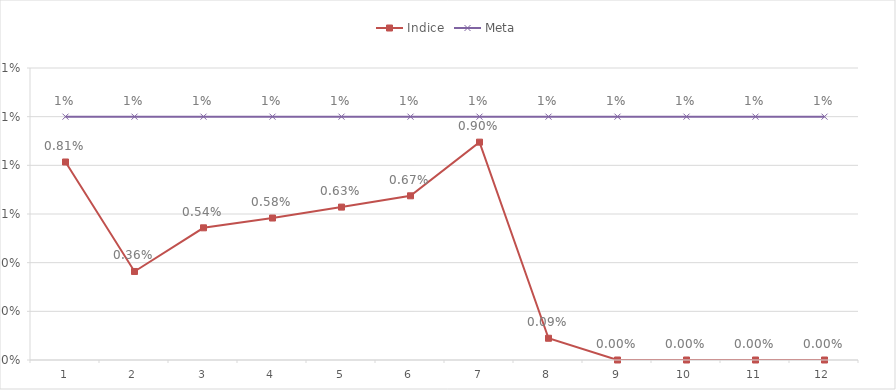
| Category | Indice | Meta |
|---|---|---|
| 0 | 0.008 | 0.01 |
| 1 | 0.004 | 0.01 |
| 2 | 0.005 | 0.01 |
| 3 | 0.006 | 0.01 |
| 4 | 0.006 | 0.01 |
| 5 | 0.007 | 0.01 |
| 6 | 0.009 | 0.01 |
| 7 | 0.001 | 0.01 |
| 8 | 0 | 0.01 |
| 9 | 0 | 0.01 |
| 10 | 0 | 0.01 |
| 11 | 0 | 0.01 |